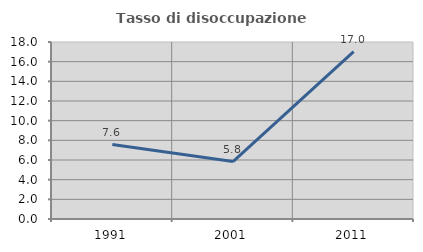
| Category | Tasso di disoccupazione giovanile  |
|---|---|
| 1991.0 | 7.566 |
| 2001.0 | 5.844 |
| 2011.0 | 17.014 |